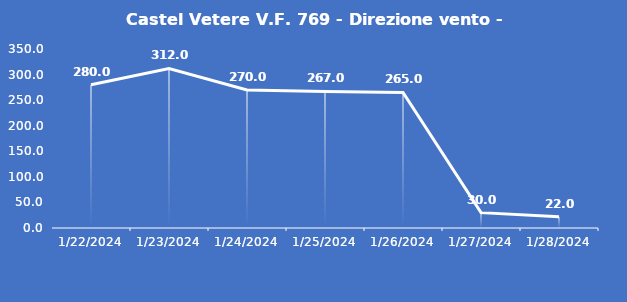
| Category | Castel Vetere V.F. 769 - Direzione vento - Grezzo (°N) |
|---|---|
| 1/22/24 | 280 |
| 1/23/24 | 312 |
| 1/24/24 | 270 |
| 1/25/24 | 267 |
| 1/26/24 | 265 |
| 1/27/24 | 30 |
| 1/28/24 | 22 |